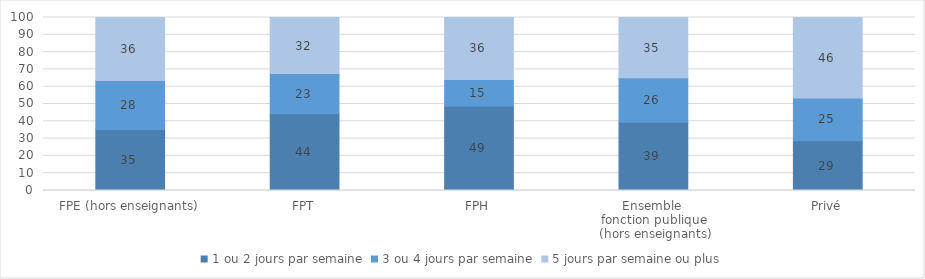
| Category | 1 ou 2 jours par semaine | 3 ou 4 jours par semaine | 5 jours par semaine ou plus |
|---|---|---|---|
| FPE (hors enseignants) | 35.21 | 28.4 | 36.39 |
| FPT | 44.4 | 23.23 | 32.37 |
| FPH | 48.87 | 15.35 | 35.78 |
| Ensemble 
fonction publique
 (hors enseignants) | 39.39 | 25.72 | 34.88 |
| Privé | 28.77 | 24.76 | 46.47 |